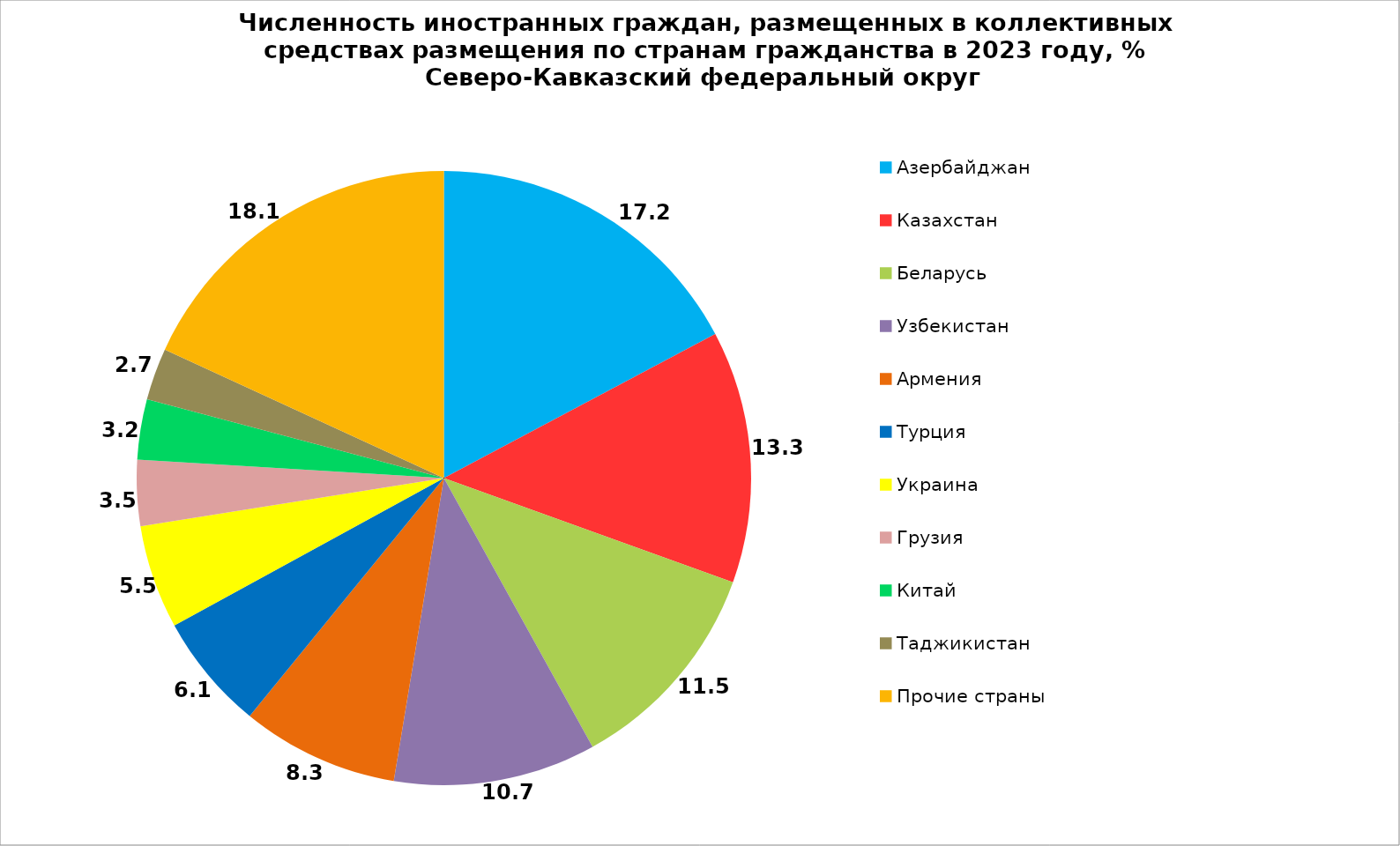
| Category | Series 0 |
|---|---|
| Азербайджан | 17.232 |
| Казахстан | 13.275 |
| Беларусь | 11.454 |
| Узбекистан | 10.651 |
| Армения | 8.279 |
| Турция | 6.141 |
| Украина | 5.457 |
| Грузия | 3.473 |
| Китай | 3.172 |
| Таджикистан | 2.735 |
| Прочие страны | 18.13 |